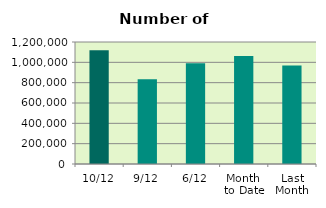
| Category | Series 0 |
|---|---|
| 10/12 | 1119572 |
| 9/12 | 832576 |
| 6/12 | 989872 |
| Month 
to Date | 1061501.143 |
| Last
Month | 969317.238 |